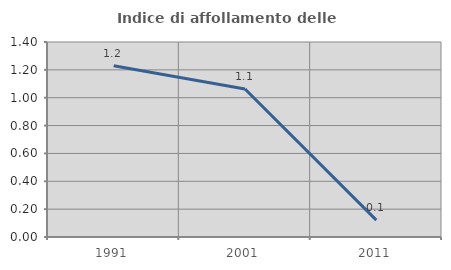
| Category | Indice di affollamento delle abitazioni  |
|---|---|
| 1991.0 | 1.229 |
| 2001.0 | 1.063 |
| 2011.0 | 0.121 |